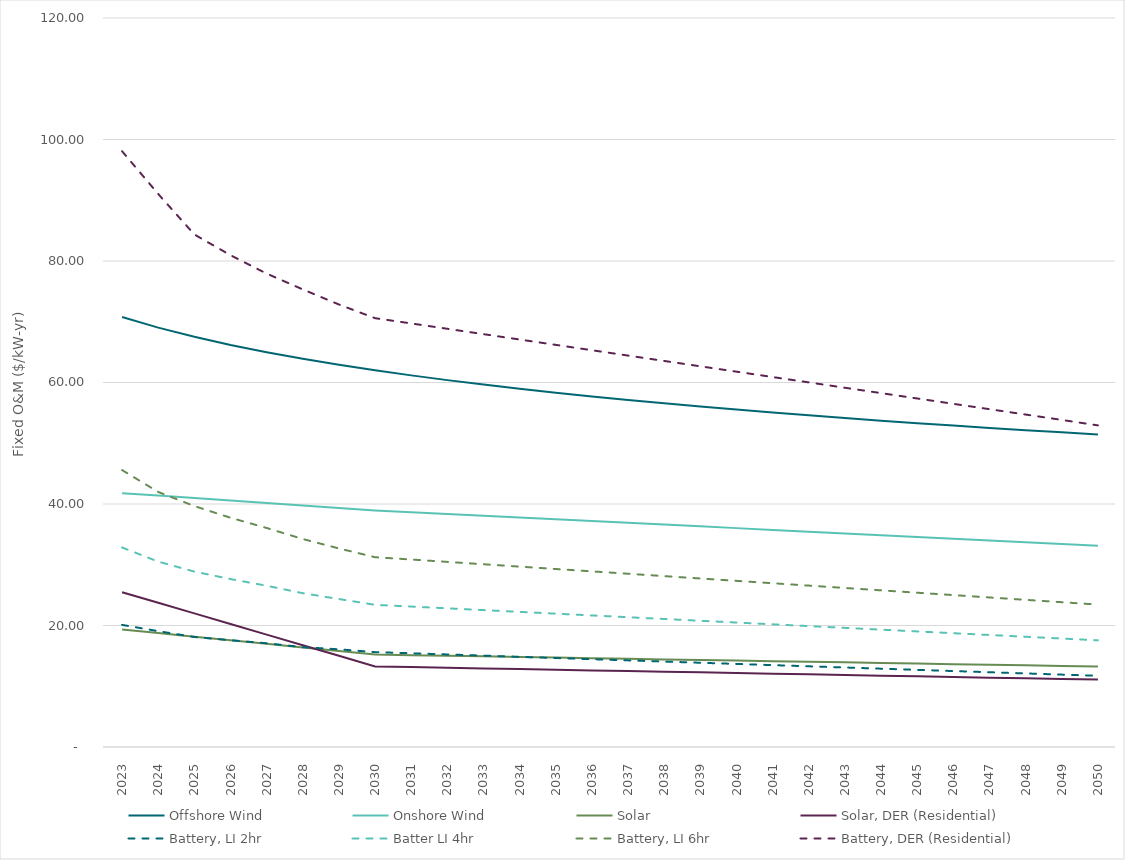
| Category | Offshore Wind | Onshore Wind | Solar | Solar, DER (Residential) | Battery, LI 2hr | Batter LI 4hr | Battery, LI 6hr | Battery, DER (Residential) |
|---|---|---|---|---|---|---|---|---|
| 2023.0 | 70.785 | 41.785 | 19.354 | 25.482 | 20.101 | 32.843 | 45.584 | 98.064 |
| 2024.0 | 69.036 | 41.38 | 18.759 | 23.736 | 19.067 | 30.516 | 41.982 | 91.036 |
| 2025.0 | 67.521 | 40.975 | 18.165 | 21.99 | 18.109 | 28.874 | 39.657 | 84.366 |
| 2026.0 | 66.185 | 40.57 | 17.573 | 20.244 | 17.574 | 27.643 | 37.738 | 80.954 |
| 2027.0 | 64.99 | 40.165 | 16.983 | 18.499 | 17.076 | 26.548 | 36.055 | 77.926 |
| 2028.0 | 63.908 | 39.76 | 16.394 | 16.753 | 16.436 | 25.316 | 34.236 | 75.326 |
| 2029.0 | 62.921 | 39.355 | 15.807 | 15.007 | 16.078 | 24.358 | 32.688 | 72.839 |
| 2030.0 | 62.013 | 38.95 | 15.222 | 13.261 | 15.615 | 23.4 | 31.24 | 70.587 |
| 2031.0 | 61.173 | 38.658 | 15.121 | 13.153 | 15.429 | 23.12 | 30.863 | 69.724 |
| 2032.0 | 60.39 | 38.366 | 15.02 | 13.044 | 15.234 | 22.827 | 30.473 | 68.842 |
| 2033.0 | 59.658 | 38.074 | 14.92 | 12.936 | 15.039 | 22.535 | 30.082 | 67.959 |
| 2034.0 | 58.97 | 37.782 | 14.82 | 12.827 | 14.844 | 22.242 | 29.692 | 67.077 |
| 2035.0 | 58.322 | 37.489 | 14.721 | 12.719 | 14.649 | 21.95 | 29.301 | 66.195 |
| 2036.0 | 57.708 | 37.197 | 14.621 | 12.611 | 14.453 | 21.657 | 28.911 | 65.312 |
| 2037.0 | 57.126 | 36.905 | 14.522 | 12.502 | 14.258 | 21.365 | 28.52 | 64.43 |
| 2038.0 | 56.573 | 36.613 | 14.423 | 12.394 | 14.063 | 21.072 | 28.13 | 63.548 |
| 2039.0 | 56.045 | 36.321 | 14.324 | 12.286 | 13.868 | 20.78 | 27.739 | 62.665 |
| 2040.0 | 55.541 | 36.029 | 14.226 | 12.177 | 13.673 | 20.487 | 27.349 | 61.783 |
| 2041.0 | 55.058 | 35.737 | 14.127 | 12.069 | 13.477 | 20.195 | 26.958 | 60.901 |
| 2042.0 | 54.595 | 35.445 | 14.029 | 11.96 | 13.282 | 19.902 | 26.568 | 60.018 |
| 2043.0 | 54.15 | 35.152 | 13.932 | 11.852 | 13.087 | 19.609 | 26.177 | 59.136 |
| 2044.0 | 53.722 | 34.86 | 13.834 | 11.744 | 12.892 | 19.317 | 25.787 | 58.254 |
| 2045.0 | 53.309 | 34.568 | 13.736 | 11.635 | 12.697 | 19.024 | 25.396 | 57.371 |
| 2046.0 | 52.911 | 34.276 | 13.639 | 11.527 | 12.502 | 18.732 | 25.006 | 56.489 |
| 2047.0 | 52.527 | 33.984 | 13.542 | 11.419 | 12.306 | 18.439 | 24.615 | 55.607 |
| 2048.0 | 52.155 | 33.692 | 13.445 | 11.31 | 12.111 | 18.147 | 24.225 | 54.724 |
| 2049.0 | 51.794 | 33.4 | 13.349 | 11.202 | 11.916 | 17.854 | 23.834 | 53.842 |
| 2050.0 | 51.445 | 33.108 | 13.252 | 11.093 | 11.723 | 17.562 | 23.441 | 52.94 |